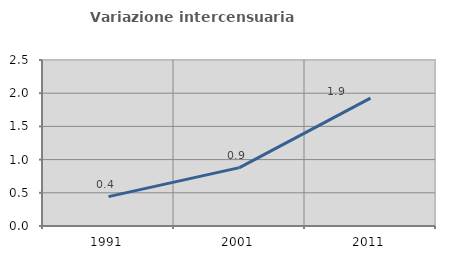
| Category | Variazione intercensuaria annua |
|---|---|
| 1991.0 | 0.442 |
| 2001.0 | 0.879 |
| 2011.0 | 1.927 |